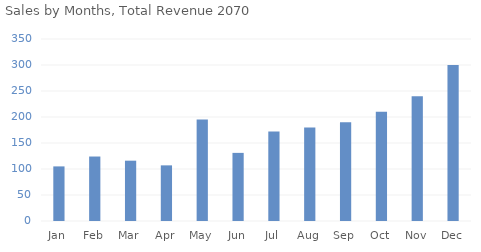
| Category | Series 0 |
|---|---|
| Jan | 105 |
| Feb | 124 |
| Mar | 116 |
| Apr | 107 |
| May | 195 |
| Jun | 131 |
| Jul | 172 |
| Aug | 180 |
| Sep | 190 |
| Oct | 210 |
| Nov | 240 |
| Dec | 300 |